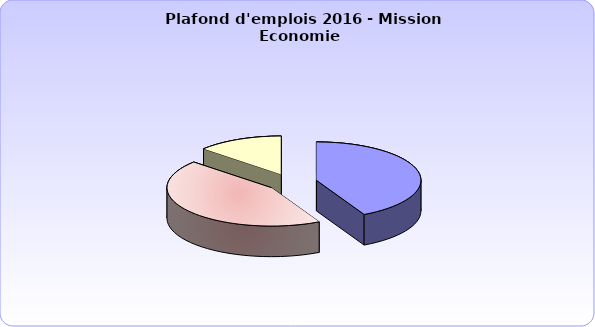
| Category | Series 0 |
|---|---|
| 134. - Développement des entreprises et du tourisme | 5227 |
| 220. - Statistiques et études économiques | 5441 |
| 305. - Stratégie économique et fiscale | 1644 |